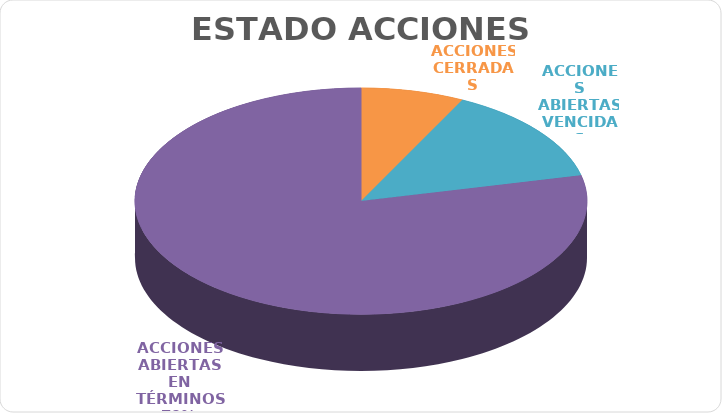
| Category | Series 0 |
|---|---|
| ACCIONES CERRADAS | 9 |
| ACCIONES ABIERTAS VENCIDAS | 17 |
| ACCIONES ABIERTAS EN TÉRMINOS | 96 |